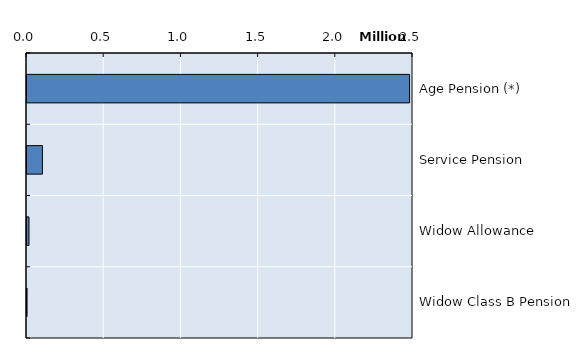
| Category | Series 0 |
|---|---|
| Age Pension (*) | 2477861 |
| Service Pension | 99939 |
| Widow Allowance | 12802 |
| Widow Class B Pension | 328 |